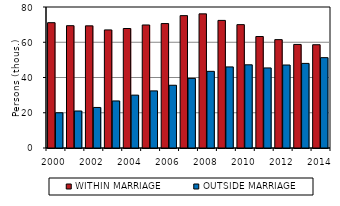
| Category | WITHIN MARRIAGE | OUTSIDE MARRIAGE |
|---|---|---|
| 2000.0 | 71.1 | 20 |
| 2001.0 | 69.4 | 21 |
| 2002.0 | 69.3 | 23 |
| 2003.0 | 67 | 26.7 |
| 2004.0 | 67.8 | 30 |
| 2005.0 | 69.8 | 32.4 |
| 2006.0 | 70.6 | 35.6 |
| 2007.0 | 75.1 | 39.5 |
| 2008.0 | 76.1 | 43.5 |
| 2009.0 | 72.4 | 46 |
| 2010.0 | 70 | 47.2 |
| 2011.0 | 63.252 | 45.421 |
| 2012.0 | 61.488 | 47.088 |
| 2013.0 | 58.751 | 48 |
| 2014.0 | 58.593 | 51.267 |